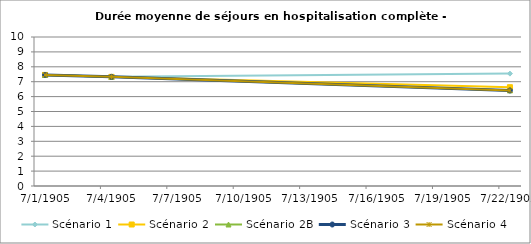
| Category | Scénario 1 | Scénario 2 | Scénario 2B | Scénario 3 | Scénario 4 |
|---|---|---|---|---|---|
| 2009.0 | 7.455 | 7.455 | 7.455 | 7.455 | 7.455 |
| 2012.0 | 7.324 | 7.324 | 7.324 | 7.324 | 7.324 |
| 2030.0 | 7.543 | 6.631 | 6.415 | 6.415 | 6.415 |